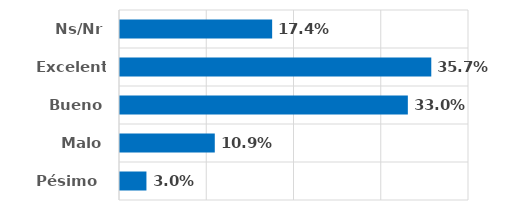
| Category | Series 0 |
|---|---|
| Pésimo  | 0.03 |
| Malo | 0.109 |
| Bueno | 0.33 |
| Excelente | 0.357 |
| Ns/Nr | 0.174 |